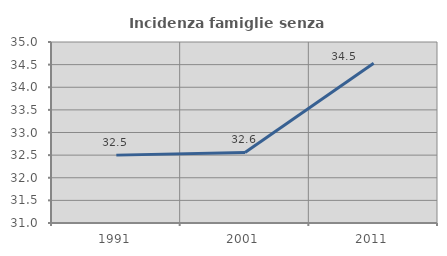
| Category | Incidenza famiglie senza nuclei |
|---|---|
| 1991.0 | 32.5 |
| 2001.0 | 32.558 |
| 2011.0 | 34.532 |